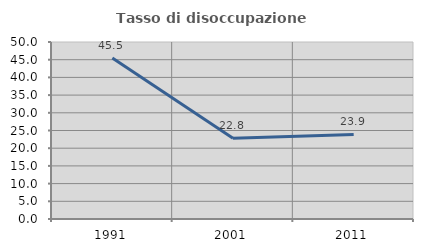
| Category | Tasso di disoccupazione giovanile  |
|---|---|
| 1991.0 | 45.472 |
| 2001.0 | 22.798 |
| 2011.0 | 23.889 |